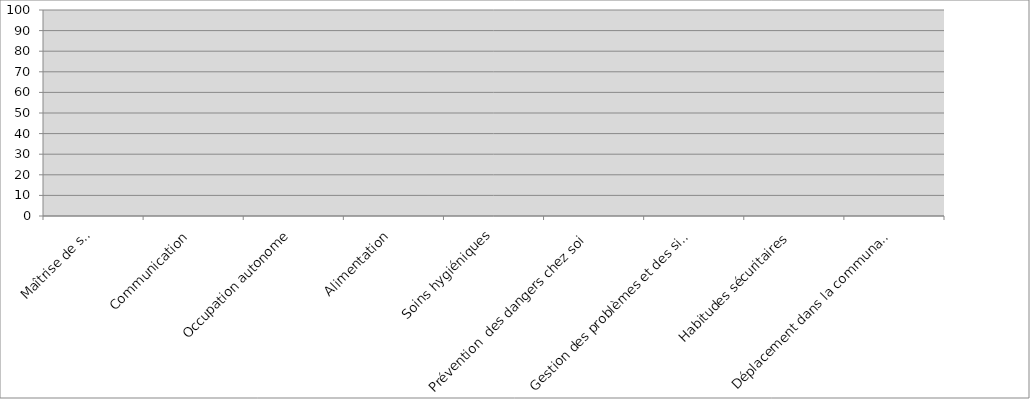
| Category | Série 4 |
|---|---|
| Maîtrise de soi | 0 |
| Communication | 0 |
| Occupation autonome | 0 |
| Alimentation | 0 |
| Soins hygiéniques | 0 |
| Prévention  des dangers chez soi | 0 |
| Gestion des problèmes et des situations  urgentes | 0 |
| Habitudes sécuritaires | 0 |
| Déplacement dans la communauté | 0 |